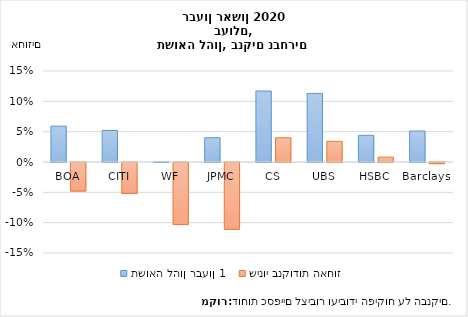
| Category | תשואה להון רבעון 1 | שינוי בנקודות האחוז |
|---|---|---|
| BOA | 0.059 | -0.047 |
| CITI | 0.052 | -0.051 |
| WF | 0 | -0.102 |
| JPMC | 0.04 | -0.11 |
| CS | 0.117 | 0.04 |
| UBS | 0.113 | 0.034 |
| HSBC | 0.044 | 0.008 |
| Barclays | 0.051 | -0.002 |